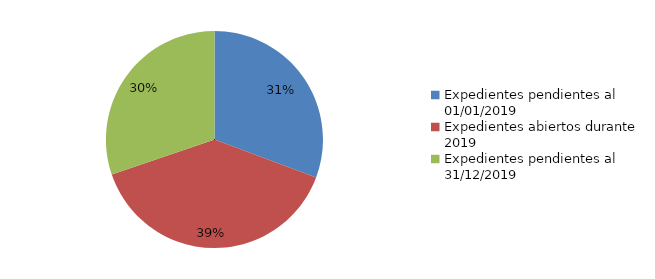
| Category | Series 0 |
|---|---|
| Expedientes pendientes al 01/01/2019 | 128 |
| Expedientes abiertos durante 2019 | 163 |
| Expedientes pendientes al 31/12/2019 | 126 |